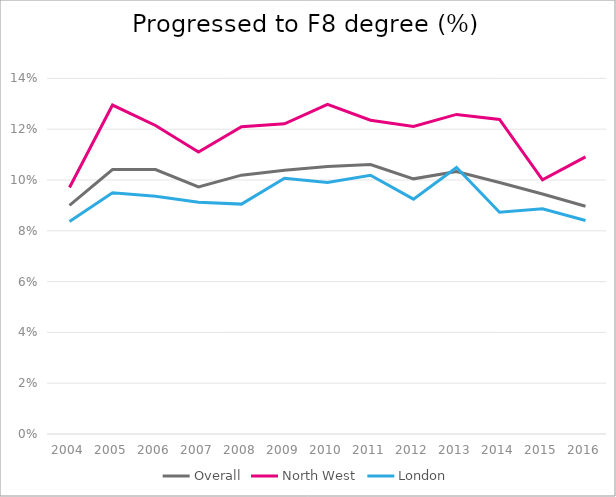
| Category | Overall | North West | London |
|---|---|---|---|
| 2004 | 0.09 | 0.097 | 0.084 |
| 2005 | 0.104 | 0.13 | 0.095 |
| 2006 | 0.104 | 0.121 | 0.094 |
| 2007 | 0.097 | 0.111 | 0.091 |
| 2008 | 0.102 | 0.121 | 0.091 |
| 2009 | 0.104 | 0.122 | 0.101 |
| 2010 | 0.105 | 0.13 | 0.099 |
| 2011 | 0.106 | 0.124 | 0.102 |
| 2012 | 0.1 | 0.121 | 0.092 |
| 2013 | 0.103 | 0.126 | 0.105 |
| 2014 | 0.099 | 0.124 | 0.087 |
| 2015 | 0.094 | 0.1 | 0.089 |
| 2016 | 0.09 | 0.109 | 0.084 |